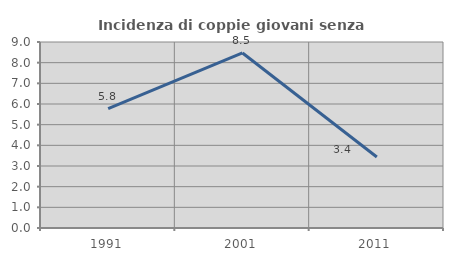
| Category | Incidenza di coppie giovani senza figli |
|---|---|
| 1991.0 | 5.774 |
| 2001.0 | 8.468 |
| 2011.0 | 3.438 |